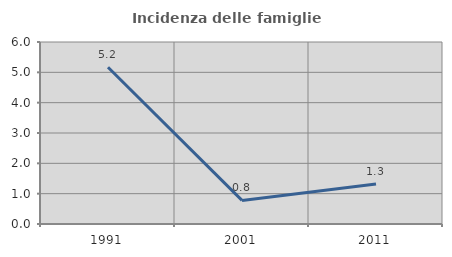
| Category | Incidenza delle famiglie numerose |
|---|---|
| 1991.0 | 5.166 |
| 2001.0 | 0.778 |
| 2011.0 | 1.322 |